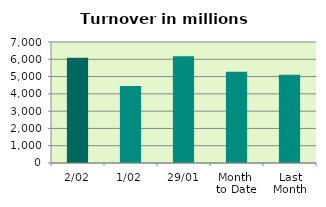
| Category | Series 0 |
|---|---|
| 2/02 | 6089.272 |
| 1/02 | 4460.058 |
| 29/01 | 6171.322 |
| Month 
to Date | 5274.665 |
| Last
Month | 5105.691 |